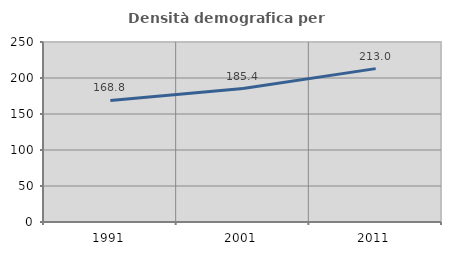
| Category | Densità demografica |
|---|---|
| 1991.0 | 168.78 |
| 2001.0 | 185.386 |
| 2011.0 | 213.013 |